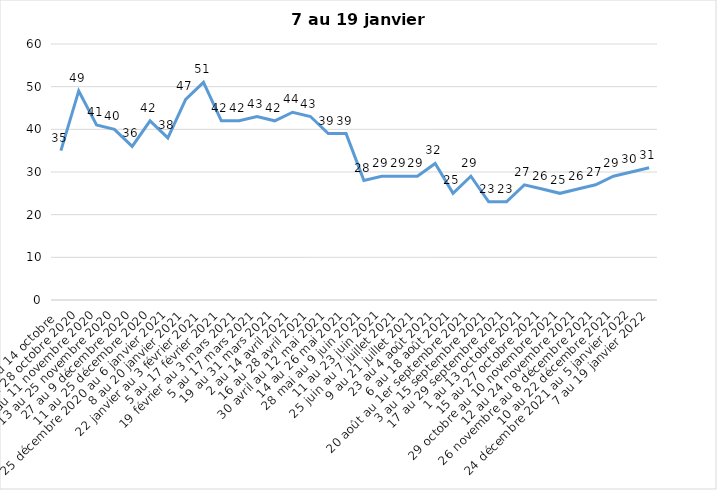
| Category | Toujours aux trois mesures |
|---|---|
| 2 au 14 octobre  | 35 |
| 16 au 28 octobre 2020 | 49 |
| 30 octobre au 11 novembre 2020 | 41 |
| 13 au 25 novembre 2020 | 40 |
| 27 au 9 décembre 2020 | 36 |
| 11 au 25 décembre 2020 | 42 |
| 25 décembre 2020 au 6 janvier 2021 | 38 |
| 8 au 20 janvier 2021 | 47 |
| 22 janvier au 3 février 2021 | 51 |
| 5 au 17 février 2021 | 42 |
| 19 février au 3 mars 2021 | 42 |
| 5 au 17 mars 2021 | 43 |
| 19 au 31 mars 2021 | 42 |
| 2 au 14 avril 2021 | 44 |
| 16 au 28 avril 2021 | 43 |
| 30 avril au 12 mai 2021 | 39 |
| 14 au 26 mai 2021 | 39 |
| 28 mai au 9 juin 2021 | 28 |
| 11 au 23 juin 2021 | 29 |
| 25 juin au 7 juillet 2021 | 29 |
| 9 au 21 juillet 2021 | 29 |
| 23 au 4 août 2021 | 32 |
| 6 au 18 août 2021 | 25 |
| 20 août au 1er septembre 2021 | 29 |
| 3 au 15 septembre 2021 | 23 |
| 17 au 29 septembre 2021 | 23 |
| 1 au 13 octobre 2021 | 27 |
| 15 au 27 octobre 2021 | 26 |
| 29 octobre au 10 novembre 2021 | 25 |
| 12 au 24 novembre 2021 | 26 |
| 26 novembre au 8 décembre 2021 | 27 |
| 10 au 22 décembre 2021 | 29 |
| 24 décembre 2021 au 5 janvier 2022 | 30 |
| 7 au 19 janvier 2022 | 31 |